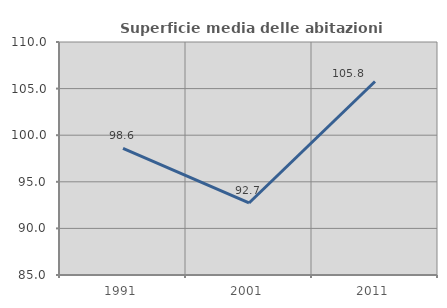
| Category | Superficie media delle abitazioni occupate |
|---|---|
| 1991.0 | 98.581 |
| 2001.0 | 92.729 |
| 2011.0 | 105.763 |